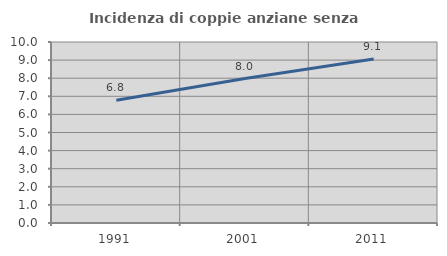
| Category | Incidenza di coppie anziane senza figli  |
|---|---|
| 1991.0 | 6.786 |
| 2001.0 | 7.98 |
| 2011.0 | 9.056 |